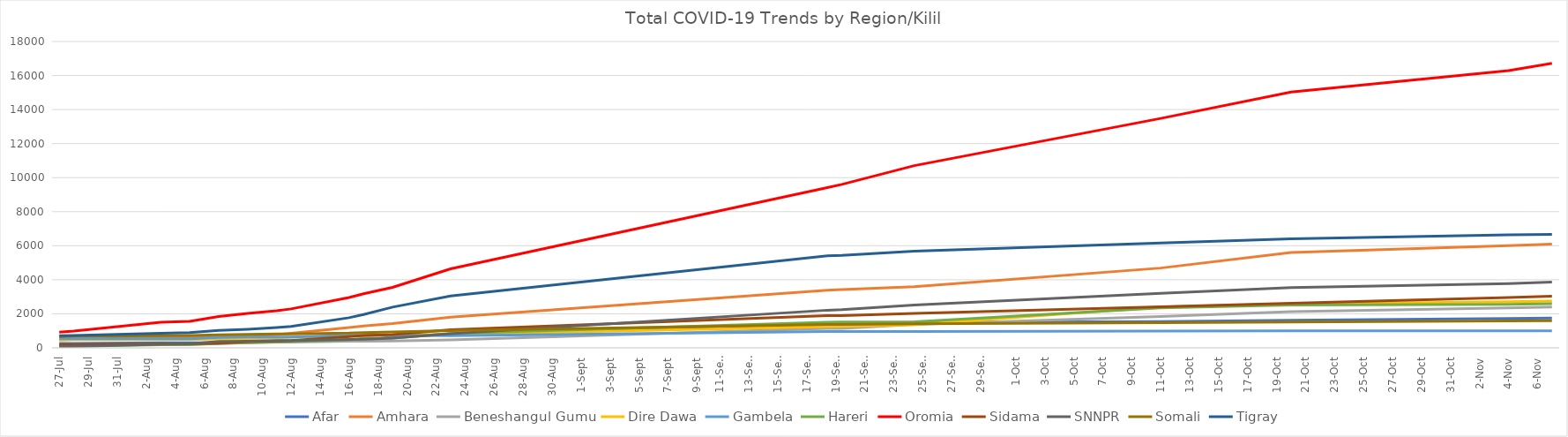
| Category | Afar | Amhara | Beneshangul Gumu | Dire Dawa | Gambela | Hareri | Oromia | Sidama | SNNPR | Somali | Tigray |
|---|---|---|---|---|---|---|---|---|---|---|---|
| 2020-07-27 | 256 | 484 | 149 | 459 | 531 | 94 | 923 | 182 | 83 | 651 | 713 |
| 2020-07-28 | 260 | 499 | 149 | 484 | 536 | 94 | 985 | 188 | 90 | 673 | 727 |
| 2020-08-03 | 292 | 607 | 219 | 484 | 536 | 181 | 1506 | 238 | 210 | 711 | 860 |
| 2020-08-05 | 293 | 627 | 221 | 484 | 536 | 181 | 1561 | 238 | 234 | 730 | 897 |
| 2020-08-07 | 299 | 641 | 245 | 528 | 614 | 256 | 1837 | 267 | 370 | 769 | 1019 |
| 2020-08-09 | 313 | 691 | 299 | 548 | 637 | 309 | 2026 | 366 | 393 | 795 | 1089 |
| 2020-08-11 | 391 | 780 | 333 | 588 | 637 | 342 | 2180 | 406 | 429 | 814 | 1189 |
| 2020-08-12 | 391 | 850 | 336 | 624 | 637 | 357 | 2288 | 430 | 432 | 821 | 1254 |
| 2020-08-16 | 415 | 1195 | 388 | 680 | 739 | 472 | 2953 | 658 | 488 | 866 | 1770 |
| 2020-08-17 | 415 | 1278 | 395 | 711 | 739 | 555 | 3177 | 721 | 503 | 901 | 1962 |
| 2020-08-19 | 650 | 1427 | 408 | 737 | 739 | 574 | 3557 | 774 | 567 | 933 | 2394 |
| 2020-08-23 | 803 | 1803 | 462 | 797 | 712 | 839 | 4640 | 1068 | 833 | 1007 | 3048 |
| 2020-09-18 | 1408 | 3388 | 1138 | 1246 | 954 | 1505 | 9415 | 1897 | 2211 | 1375 | 5403 |
| 2020-09-19 | 1447 | 3427 | 1138 | 1260 | 954 | 1514 | 9602 | 1897 | 2242 | 1376 | 5433 |
| 2020-09-24 | 1488 | 3597 | 1375 | 1366 | 966 | 1530 | 10707 | 2025 | 2520 | 1418 | 5683 |
| 2020-10-11 | 1547 | 4688 | 1846 | 2393 | 991 | 2343 | 13480 | 2411 | 3199 | 1480 | 6165 |
| 2020-10-20 | 1618 | 5604 | 2121 | 2577 | 993 | 2520 | 15033 | 2624 | 3543 | 1513 | 6402 |
| 2020-11-04 | 1727 | 6010 | 2343 | 2704 | 997 | 2556 | 16283 | 2954 | 3776 | 1576 | 6639 |
| 2020-11-07 | 1757 | 6094 | 2397 | 2749 | 997 | 2588 | 16716 | 3039 | 3863 | 1590 | 6662 |